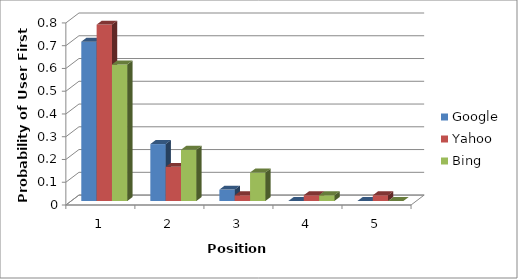
| Category | Google | Yahoo | Bing |
|---|---|---|---|
| 0 | 0.7 | 0.775 | 0.6 |
| 1 | 0.25 | 0.15 | 0.225 |
| 2 | 0.05 | 0.025 | 0.125 |
| 3 | 0 | 0.025 | 0.025 |
| 4 | 0 | 0.025 | 0 |